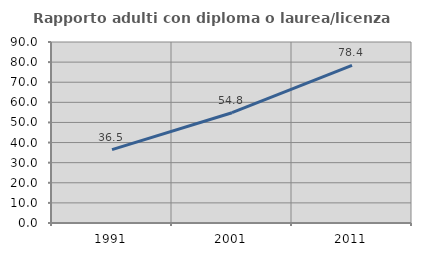
| Category | Rapporto adulti con diploma o laurea/licenza media  |
|---|---|
| 1991.0 | 36.486 |
| 2001.0 | 54.839 |
| 2011.0 | 78.367 |